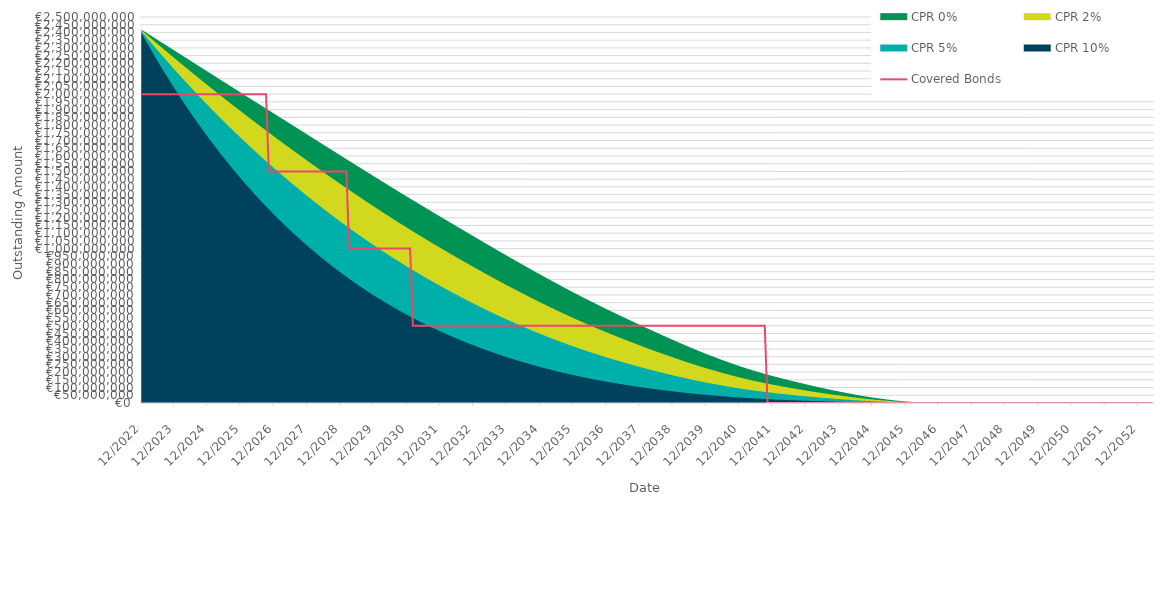
| Category | Covered Bonds |
|---|---|
| 2022-12-31 | 2000000000 |
| 2023-01-31 | 2000000000 |
| 2023-02-28 | 2000000000 |
| 2023-03-31 | 2000000000 |
| 2023-04-30 | 2000000000 |
| 2023-05-31 | 2000000000 |
| 2023-06-30 | 2000000000 |
| 2023-07-31 | 2000000000 |
| 2023-08-31 | 2000000000 |
| 2023-09-30 | 2000000000 |
| 2023-10-31 | 2000000000 |
| 2023-11-30 | 2000000000 |
| 2023-12-31 | 2000000000 |
| 2024-01-31 | 2000000000 |
| 2024-02-29 | 2000000000 |
| 2024-03-31 | 2000000000 |
| 2024-04-30 | 2000000000 |
| 2024-05-31 | 2000000000 |
| 2024-06-30 | 2000000000 |
| 2024-07-31 | 2000000000 |
| 2024-08-31 | 2000000000 |
| 2024-09-30 | 2000000000 |
| 2024-10-31 | 2000000000 |
| 2024-11-30 | 2000000000 |
| 2024-12-31 | 2000000000 |
| 2025-01-31 | 2000000000 |
| 2025-02-28 | 2000000000 |
| 2025-03-31 | 2000000000 |
| 2025-04-30 | 2000000000 |
| 2025-05-31 | 2000000000 |
| 2025-06-30 | 2000000000 |
| 2025-07-31 | 2000000000 |
| 2025-08-31 | 2000000000 |
| 2025-09-30 | 2000000000 |
| 2025-10-31 | 2000000000 |
| 2025-11-30 | 2000000000 |
| 2025-12-31 | 2000000000 |
| 2026-01-31 | 2000000000 |
| 2026-02-28 | 2000000000 |
| 2026-03-31 | 2000000000 |
| 2026-04-30 | 2000000000 |
| 2026-05-31 | 2000000000 |
| 2026-06-30 | 2000000000 |
| 2026-07-31 | 2000000000 |
| 2026-08-31 | 2000000000 |
| 2026-09-30 | 2000000000 |
| 2026-10-31 | 1500000000 |
| 2026-11-30 | 1500000000 |
| 2026-12-31 | 1500000000 |
| 2027-01-31 | 1500000000 |
| 2027-02-28 | 1500000000 |
| 2027-03-31 | 1500000000 |
| 2027-04-30 | 1500000000 |
| 2027-05-31 | 1500000000 |
| 2027-06-30 | 1500000000 |
| 2027-07-31 | 1500000000 |
| 2027-08-31 | 1500000000 |
| 2027-09-30 | 1500000000 |
| 2027-10-31 | 1500000000 |
| 2027-11-30 | 1500000000 |
| 2027-12-31 | 1500000000 |
| 2028-01-31 | 1500000000 |
| 2028-02-29 | 1500000000 |
| 2028-03-31 | 1500000000 |
| 2028-04-30 | 1500000000 |
| 2028-05-31 | 1500000000 |
| 2028-06-30 | 1500000000 |
| 2028-07-31 | 1500000000 |
| 2028-08-31 | 1500000000 |
| 2028-09-30 | 1500000000 |
| 2028-10-31 | 1500000000 |
| 2028-11-30 | 1500000000 |
| 2028-12-31 | 1500000000 |
| 2029-01-31 | 1500000000 |
| 2029-02-28 | 1500000000 |
| 2029-03-31 | 1000000000 |
| 2029-04-30 | 1000000000 |
| 2029-05-31 | 1000000000 |
| 2029-06-30 | 1000000000 |
| 2029-07-31 | 1000000000 |
| 2029-08-31 | 1000000000 |
| 2029-09-30 | 1000000000 |
| 2029-10-31 | 1000000000 |
| 2029-11-30 | 1000000000 |
| 2029-12-31 | 1000000000 |
| 2030-01-31 | 1000000000 |
| 2030-02-28 | 1000000000 |
| 2030-03-31 | 1000000000 |
| 2030-04-30 | 1000000000 |
| 2030-05-31 | 1000000000 |
| 2030-06-30 | 1000000000 |
| 2030-07-31 | 1000000000 |
| 2030-08-31 | 1000000000 |
| 2030-09-30 | 1000000000 |
| 2030-10-31 | 1000000000 |
| 2030-11-30 | 1000000000 |
| 2030-12-31 | 1000000000 |
| 2031-01-31 | 1000000000 |
| 2031-02-28 | 500000000 |
| 2031-03-31 | 500000000 |
| 2031-04-30 | 500000000 |
| 2031-05-31 | 500000000 |
| 2031-06-30 | 500000000 |
| 2031-07-31 | 500000000 |
| 2031-08-31 | 500000000 |
| 2031-09-30 | 500000000 |
| 2031-10-31 | 500000000 |
| 2031-11-30 | 500000000 |
| 2031-12-31 | 500000000 |
| 2032-01-31 | 500000000 |
| 2032-02-29 | 500000000 |
| 2032-03-31 | 500000000 |
| 2032-04-30 | 500000000 |
| 2032-05-31 | 500000000 |
| 2032-06-30 | 500000000 |
| 2032-07-31 | 500000000 |
| 2032-08-31 | 500000000 |
| 2032-09-30 | 500000000 |
| 2032-10-31 | 500000000 |
| 2032-11-30 | 500000000 |
| 2032-12-31 | 500000000 |
| 2033-01-31 | 500000000 |
| 2033-02-28 | 500000000 |
| 2033-03-31 | 500000000 |
| 2033-04-30 | 500000000 |
| 2033-05-31 | 500000000 |
| 2033-06-30 | 500000000 |
| 2033-07-31 | 500000000 |
| 2033-08-31 | 500000000 |
| 2033-09-30 | 500000000 |
| 2033-10-31 | 500000000 |
| 2033-11-30 | 500000000 |
| 2033-12-31 | 500000000 |
| 2034-01-31 | 500000000 |
| 2034-02-28 | 500000000 |
| 2034-03-31 | 500000000 |
| 2034-04-30 | 500000000 |
| 2034-05-31 | 500000000 |
| 2034-06-30 | 500000000 |
| 2034-07-31 | 500000000 |
| 2034-08-31 | 500000000 |
| 2034-09-30 | 500000000 |
| 2034-10-31 | 500000000 |
| 2034-11-30 | 500000000 |
| 2034-12-31 | 500000000 |
| 2035-01-31 | 500000000 |
| 2035-02-28 | 500000000 |
| 2035-03-31 | 500000000 |
| 2035-04-30 | 500000000 |
| 2035-05-31 | 500000000 |
| 2035-06-30 | 500000000 |
| 2035-07-31 | 500000000 |
| 2035-08-31 | 500000000 |
| 2035-09-30 | 500000000 |
| 2035-10-31 | 500000000 |
| 2035-11-30 | 500000000 |
| 2035-12-31 | 500000000 |
| 2036-01-31 | 500000000 |
| 2036-02-29 | 500000000 |
| 2036-03-31 | 500000000 |
| 2036-04-30 | 500000000 |
| 2036-05-31 | 500000000 |
| 2036-06-30 | 500000000 |
| 2036-07-31 | 500000000 |
| 2036-08-31 | 500000000 |
| 2036-09-30 | 500000000 |
| 2036-10-31 | 500000000 |
| 2036-11-30 | 500000000 |
| 2036-12-31 | 500000000 |
| 2037-01-31 | 500000000 |
| 2037-02-28 | 500000000 |
| 2037-03-31 | 500000000 |
| 2037-04-30 | 500000000 |
| 2037-05-31 | 500000000 |
| 2037-06-30 | 500000000 |
| 2037-07-31 | 500000000 |
| 2037-08-31 | 500000000 |
| 2037-09-30 | 500000000 |
| 2037-10-31 | 500000000 |
| 2037-11-30 | 500000000 |
| 2037-12-31 | 500000000 |
| 2038-01-31 | 500000000 |
| 2038-02-28 | 500000000 |
| 2038-03-31 | 500000000 |
| 2038-04-30 | 500000000 |
| 2038-05-31 | 500000000 |
| 2038-06-30 | 500000000 |
| 2038-07-31 | 500000000 |
| 2038-08-31 | 500000000 |
| 2038-09-30 | 500000000 |
| 2038-10-31 | 500000000 |
| 2038-11-30 | 500000000 |
| 2038-12-31 | 500000000 |
| 2039-01-31 | 500000000 |
| 2039-02-28 | 500000000 |
| 2039-03-31 | 500000000 |
| 2039-04-30 | 500000000 |
| 2039-05-31 | 500000000 |
| 2039-06-30 | 500000000 |
| 2039-07-31 | 500000000 |
| 2039-08-31 | 500000000 |
| 2039-09-30 | 500000000 |
| 2039-10-31 | 500000000 |
| 2039-11-30 | 500000000 |
| 2039-12-31 | 500000000 |
| 2040-01-31 | 500000000 |
| 2040-02-29 | 500000000 |
| 2040-03-31 | 500000000 |
| 2040-04-30 | 500000000 |
| 2040-05-31 | 500000000 |
| 2040-06-30 | 500000000 |
| 2040-07-31 | 500000000 |
| 2040-08-31 | 500000000 |
| 2040-09-30 | 500000000 |
| 2040-10-31 | 500000000 |
| 2040-11-30 | 500000000 |
| 2040-12-31 | 500000000 |
| 2041-01-31 | 500000000 |
| 2041-02-28 | 500000000 |
| 2041-03-31 | 500000000 |
| 2041-04-30 | 500000000 |
| 2041-05-31 | 500000000 |
| 2041-06-30 | 500000000 |
| 2041-07-31 | 500000000 |
| 2041-08-31 | 500000000 |
| 2041-09-30 | 500000000 |
| 2041-10-31 | 0 |
| 2041-11-30 | 0 |
| 2041-12-31 | 0 |
| 2042-01-31 | 0 |
| 2042-02-28 | 0 |
| 2042-03-31 | 0 |
| 2042-04-30 | 0 |
| 2042-05-31 | 0 |
| 2042-06-30 | 0 |
| 2042-07-31 | 0 |
| 2042-08-31 | 0 |
| 2042-09-30 | 0 |
| 2042-10-31 | 0 |
| 2042-11-30 | 0 |
| 2042-12-31 | 0 |
| 2043-01-31 | 0 |
| 2043-02-28 | 0 |
| 2043-03-31 | 0 |
| 2043-04-30 | 0 |
| 2043-05-31 | 0 |
| 2043-06-30 | 0 |
| 2043-07-31 | 0 |
| 2043-08-31 | 0 |
| 2043-09-30 | 0 |
| 2043-10-31 | 0 |
| 2043-11-30 | 0 |
| 2043-12-31 | 0 |
| 2044-01-31 | 0 |
| 2044-02-29 | 0 |
| 2044-03-31 | 0 |
| 2044-04-30 | 0 |
| 2044-05-31 | 0 |
| 2044-06-30 | 0 |
| 2044-07-31 | 0 |
| 2044-08-31 | 0 |
| 2044-09-30 | 0 |
| 2044-10-31 | 0 |
| 2044-11-30 | 0 |
| 2044-12-31 | 0 |
| 2045-01-31 | 0 |
| 2045-02-28 | 0 |
| 2045-03-31 | 0 |
| 2045-04-30 | 0 |
| 2045-05-31 | 0 |
| 2045-06-30 | 0 |
| 2045-07-31 | 0 |
| 2045-08-31 | 0 |
| 2045-09-30 | 0 |
| 2045-10-31 | 0 |
| 2045-11-30 | 0 |
| 2045-12-31 | 0 |
| 2046-01-31 | 0 |
| 2046-02-28 | 0 |
| 2046-03-31 | 0 |
| 2046-04-30 | 0 |
| 2046-05-31 | 0 |
| 2046-06-30 | 0 |
| 2046-07-31 | 0 |
| 2046-08-31 | 0 |
| 2046-09-30 | 0 |
| 2046-10-31 | 0 |
| 2046-11-30 | 0 |
| 2046-12-31 | 0 |
| 2047-01-31 | 0 |
| 2047-02-28 | 0 |
| 2047-03-31 | 0 |
| 2047-04-30 | 0 |
| 2047-05-31 | 0 |
| 2047-06-30 | 0 |
| 2047-07-31 | 0 |
| 2047-08-31 | 0 |
| 2047-09-30 | 0 |
| 2047-10-31 | 0 |
| 2047-11-30 | 0 |
| 2047-12-31 | 0 |
| 2048-01-31 | 0 |
| 2048-02-29 | 0 |
| 2048-03-31 | 0 |
| 2048-04-30 | 0 |
| 2048-05-31 | 0 |
| 2048-06-30 | 0 |
| 2048-07-31 | 0 |
| 2048-08-31 | 0 |
| 2048-09-30 | 0 |
| 2048-10-31 | 0 |
| 2048-11-30 | 0 |
| 2048-12-31 | 0 |
| 2049-01-31 | 0 |
| 2049-02-28 | 0 |
| 2049-03-31 | 0 |
| 2049-04-30 | 0 |
| 2049-05-31 | 0 |
| 2049-06-30 | 0 |
| 2049-07-31 | 0 |
| 2049-08-31 | 0 |
| 2049-09-30 | 0 |
| 2049-10-31 | 0 |
| 2049-11-30 | 0 |
| 2049-12-31 | 0 |
| 2050-01-31 | 0 |
| 2050-02-28 | 0 |
| 2050-03-31 | 0 |
| 2050-04-30 | 0 |
| 2050-05-31 | 0 |
| 2050-06-30 | 0 |
| 2050-07-31 | 0 |
| 2050-08-31 | 0 |
| 2050-09-30 | 0 |
| 2050-10-31 | 0 |
| 2050-11-30 | 0 |
| 2050-12-31 | 0 |
| 2051-01-31 | 0 |
| 2051-02-28 | 0 |
| 2051-03-31 | 0 |
| 2051-04-30 | 0 |
| 2051-05-31 | 0 |
| 2051-06-30 | 0 |
| 2051-07-31 | 0 |
| 2051-08-31 | 0 |
| 2051-09-30 | 0 |
| 2051-10-31 | 0 |
| 2051-11-30 | 0 |
| 2051-12-31 | 0 |
| 2052-01-31 | 0 |
| 2052-02-29 | 0 |
| 2052-03-31 | 0 |
| 2052-04-30 | 0 |
| 2052-05-31 | 0 |
| 2052-06-30 | 0 |
| 2052-07-31 | 0 |
| 2052-08-31 | 0 |
| 2052-09-30 | 0 |
| 2052-10-31 | 0 |
| 2052-11-30 | 0 |
| 2052-12-31 | 0 |
| 2053-01-31 | 0 |
| 2053-02-28 | 0 |
| 2053-03-31 | 0 |
| 2053-04-30 | 0 |
| 2053-05-31 | 0 |